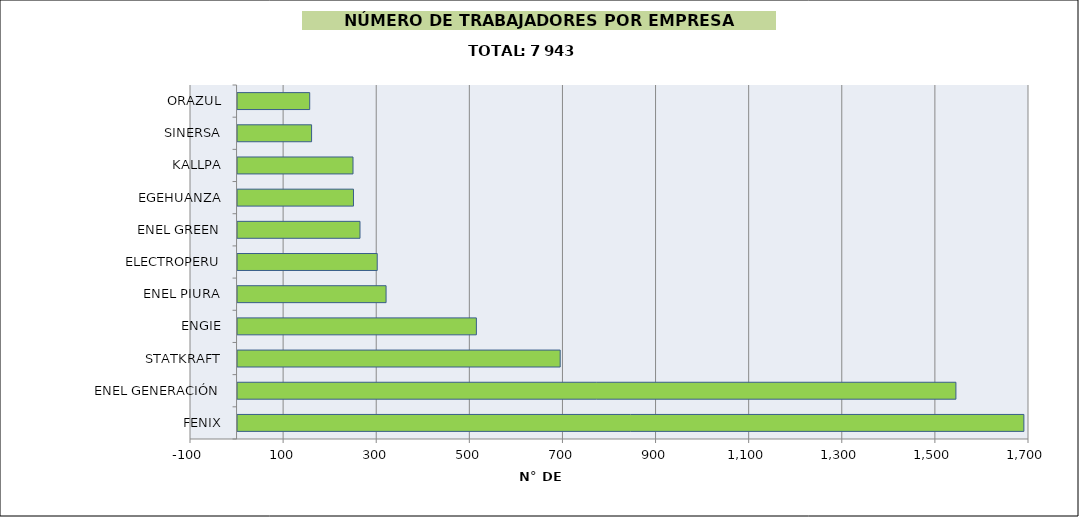
| Category | Series 0 |
|---|---|
| FENIX | 1689 |
| ENEL GENERACIÓN | 1543 |
| STATKRAFT | 693 |
| ENGIE | 513 |
| ENEL PIURA | 319 |
| ELECTROPERU | 300 |
| ENEL GREEN | 263 |
| EGEHUANZA | 249 |
| KALLPA | 248 |
| SINERSA | 159 |
| ORAZUL | 155 |